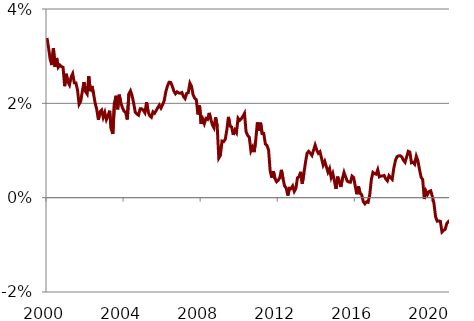
| Category | Series 0 |
|---|---|
| 2000.0 | 3.386 |
| 2000.0 | 3.171 |
| 2000.0 | 2.931 |
| 2000.0 | 2.812 |
| 2000.0 | 3.168 |
| 2000.0 | 2.774 |
| 2000.0 | 2.961 |
| 2000.0 | 2.765 |
| 2000.0 | 2.811 |
| 2000.0 | 2.779 |
| 2000.0 | 2.764 |
| 2000.0 | 2.364 |
| 2001.0 | 2.627 |
| 2001.0 | 2.458 |
| 2001.0 | 2.391 |
| 2001.0 | 2.553 |
| 2001.0 | 2.628 |
| 2001.0 | 2.435 |
| 2001.0 | 2.433 |
| 2001.0 | 2.284 |
| 2001.0 | 1.981 |
| 2001.0 | 2.042 |
| 2001.0 | 2.253 |
| 2001.0 | 2.451 |
| 2002.0 | 2.25 |
| 2002.0 | 2.198 |
| 2002.0 | 2.575 |
| 2002.0 | 2.258 |
| 2002.0 | 2.367 |
| 2002.0 | 2.2 |
| 2002.0 | 2.003 |
| 2002.0 | 1.867 |
| 2002.0 | 1.652 |
| 2002.0 | 1.82 |
| 2002.0 | 1.856 |
| 2002.0 | 1.703 |
| 2003.0 | 1.806 |
| 2003.0 | 1.654 |
| 2003.0 | 1.732 |
| 2003.0 | 1.843 |
| 2003.0 | 1.453 |
| 2003.0 | 1.351 |
| 2003.0 | 2.007 |
| 2003.0 | 2.161 |
| 2003.0 | 1.873 |
| 2003.0 | 2.184 |
| 2003.0 | 2.009 |
| 2003.0 | 1.905 |
| 2004.0 | 1.833 |
| 2004.0 | 1.805 |
| 2004.0 | 1.658 |
| 2004.0 | 2.202 |
| 2004.0 | 2.265 |
| 2004.0 | 2.163 |
| 2004.0 | 1.998 |
| 2004.0 | 1.808 |
| 2004.0 | 1.774 |
| 2004.0 | 1.749 |
| 2004.0 | 1.883 |
| 2004.0 | 1.883 |
| 2005.0 | 1.851 |
| 2005.0 | 1.799 |
| 2005.0 | 2.025 |
| 2005.0 | 1.818 |
| 2005.0 | 1.736 |
| 2005.0 | 1.705 |
| 2005.0 | 1.82 |
| 2005.0 | 1.789 |
| 2005.0 | 1.846 |
| 2005.0 | 1.911 |
| 2005.0 | 1.964 |
| 2005.0 | 1.9 |
| 2006.0 | 1.971 |
| 2006.0 | 2.056 |
| 2006.0 | 2.246 |
| 2006.0 | 2.364 |
| 2006.0 | 2.446 |
| 2006.0 | 2.444 |
| 2006.0 | 2.368 |
| 2006.0 | 2.261 |
| 2006.0 | 2.203 |
| 2006.0 | 2.244 |
| 2006.0 | 2.221 |
| 2006.0 | 2.213 |
| 2007.0 | 2.231 |
| 2007.0 | 2.144 |
| 2007.0 | 2.101 |
| 2007.0 | 2.211 |
| 2007.0 | 2.226 |
| 2007.0 | 2.428 |
| 2007.0 | 2.36 |
| 2007.0 | 2.18 |
| 2007.0 | 2.108 |
| 2007.0 | 2.078 |
| 2007.0 | 1.766 |
| 2007.0 | 1.953 |
| 2008.0 | 1.565 |
| 2008.0 | 1.667 |
| 2008.0 | 1.569 |
| 2008.0 | 1.679 |
| 2008.0 | 1.66 |
| 2008.0 | 1.797 |
| 2008.0 | 1.667 |
| 2008.0 | 1.543 |
| 2008.0 | 1.48 |
| 2008.0 | 1.703 |
| 2008.0 | 1.523 |
| 2008.0 | 0.839 |
| 2009.0 | 0.899 |
| 2009.0 | 1.2 |
| 2009.0 | 1.187 |
| 2009.0 | 1.234 |
| 2009.0 | 1.433 |
| 2009.0 | 1.713 |
| 2009.0 | 1.518 |
| 2009.0 | 1.497 |
| 2009.0 | 1.331 |
| 2009.0 | 1.434 |
| 2009.0 | 1.377 |
| 2009.0 | 1.684 |
| 2010.0 | 1.639 |
| 2010.0 | 1.673 |
| 2010.0 | 1.723 |
| 2010.0 | 1.787 |
| 2010.0 | 1.397 |
| 2010.0 | 1.319 |
| 2010.0 | 1.28 |
| 2010.0 | 0.991 |
| 2010.0 | 1.069 |
| 2010.0 | 0.966 |
| 2010.0 | 1.214 |
| 2010.0 | 1.595 |
| 2011.0 | 1.423 |
| 2011.0 | 1.59 |
| 2011.0 | 1.362 |
| 2011.0 | 1.361 |
| 2011.0 | 1.138 |
| 2011.0 | 1.106 |
| 2011.0 | 1.011 |
| 2011.0 | 0.569 |
| 2011.0 | 0.422 |
| 2011.0 | 0.562 |
| 2011.0 | 0.401 |
| 2011.0 | 0.338 |
| 2012.0 | 0.369 |
| 2012.0 | 0.424 |
| 2012.0 | 0.59 |
| 2012.0 | 0.4 |
| 2012.0 | 0.245 |
| 2012.0 | 0.204 |
| 2012.0 | 0.045 |
| 2012.0 | 0.2 |
| 2012.0 | 0.191 |
| 2012.0 | 0.247 |
| 2012.0 | 0.132 |
| 2012.0 | 0.194 |
| 2013.0 | 0.421 |
| 2013.0 | 0.442 |
| 2013.0 | 0.548 |
| 2013.0 | 0.298 |
| 2013.0 | 0.516 |
| 2013.0 | 0.75 |
| 2013.0 | 0.945 |
| 2013.0 | 0.982 |
| 2013.0 | 0.941 |
| 2013.0 | 0.895 |
| 2013.0 | 1.004 |
| 2013.0 | 1.115 |
| 2014.0 | 1.011 |
| 2014.0 | 0.941 |
| 2014.0 | 0.975 |
| 2014.0 | 0.835 |
| 2014.0 | 0.691 |
| 2014.0 | 0.77 |
| 2014.0 | 0.658 |
| 2014.0 | 0.541 |
| 2014.0 | 0.617 |
| 2014.0 | 0.427 |
| 2014.0 | 0.514 |
| 2014.0 | 0.358 |
| 2015.0 | 0.186 |
| 2015.0 | 0.446 |
| 2015.0 | 0.337 |
| 2015.0 | 0.228 |
| 2015.0 | 0.406 |
| 2015.0 | 0.536 |
| 2015.0 | 0.437 |
| 2015.0 | 0.352 |
| 2015.0 | 0.331 |
| 2015.0 | 0.327 |
| 2015.0 | 0.457 |
| 2015.0 | 0.427 |
| 2016.0 | 0.24 |
| 2016.0 | 0.073 |
| 2016.0 | 0.241 |
| 2016.0 | 0.094 |
| 2016.0 | 0.061 |
| 2016.0 | -0.084 |
| 2016.0 | -0.13 |
| 2016.0 | -0.088 |
| 2016.0 | -0.098 |
| 2016.0 | 0.055 |
| 2016.0 | 0.382 |
| 2016.0 | 0.536 |
| 2017.0 | 0.508 |
| 2017.0 | 0.498 |
| 2017.0 | 0.593 |
| 2017.0 | 0.442 |
| 2017.0 | 0.459 |
| 2017.0 | 0.46 |
| 2017.0 | 0.47 |
| 2017.0 | 0.395 |
| 2017.0 | 0.356 |
| 2017.0 | 0.467 |
| 2017.0 | 0.425 |
| 2017.0 | 0.389 |
| 2018.0 | 0.624 |
| 2018.0 | 0.787 |
| 2018.0 | 0.87 |
| 2018.0 | 0.886 |
| 2018.0 | 0.888 |
| 2018.0 | 0.864 |
| 2018.0 | 0.794 |
| 2018.0 | 0.75 |
| 2018.0 | 0.864 |
| 2018.0 | 0.983 |
| 2018.0 | 0.966 |
| 2018.0 | 0.739 |
| 2019.0 | 0.752 |
| 2019.0 | 0.709 |
| 2019.0 | 0.878 |
| 2019.0 | 0.783 |
| 2019.0 | 0.597 |
| 2019.0 | 0.433 |
| 2019.0 | 0.384 |
| 2019.0 | -0.029 |
| 2019.0 | 0.14 |
| 2019.0 | 0.068 |
| 2019.0 | 0.131 |
| 2019.0 | 0.145 |
| 2020.0 | 0.025 |
| 2020.0 | -0.119 |
| 2020.0 | -0.4 |
| 2020.0 | -0.498 |
| 2020.0 | -0.492 |
| 2020.0 | -0.502 |
| 2020.0 | -0.727 |
| 2020.0 | -0.691 |
| 2020.0 | -0.671 |
| 2020.0 | -0.548 |
| 2020.0 | -0.507 |
| 2020.0 | -0.48 |